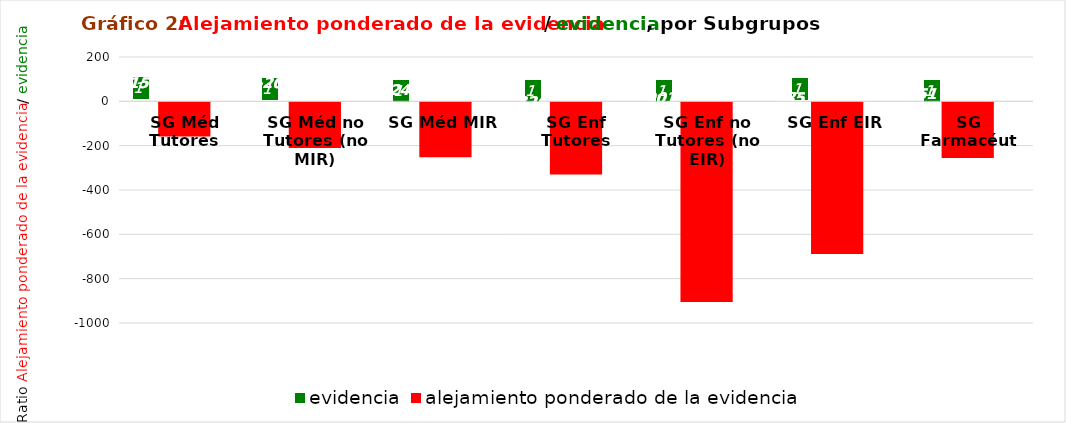
| Category | evidencia | alejamiento ponderado de la evidencia |
|---|---|---|
| SG Méd Tutores | 1 | -154.48 |
| SG Méd no Tutores (no MIR) | 1 | -205.911 |
| SG Méd MIR | 1 | -247.63 |
| SG Enf Tutores | 1 | -325.739 |
| SG Enf no Tutores (no EIR) | 1 | -900.686 |
| SG Enf EIR | 1 | -684.667 |
| SG Farmacéut | 1 | -251 |